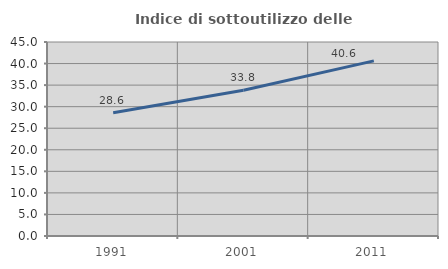
| Category | Indice di sottoutilizzo delle abitazioni  |
|---|---|
| 1991.0 | 28.571 |
| 2001.0 | 33.82 |
| 2011.0 | 40.623 |